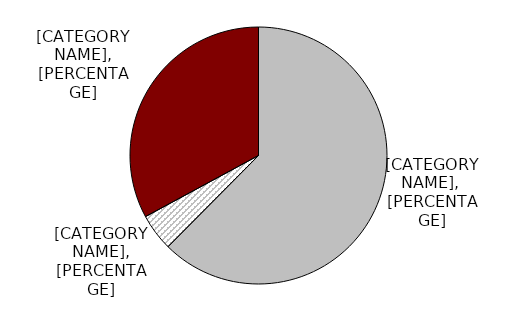
| Category | Series 0 |
|---|---|
| Contributing participants | 0.624 |
| Non-contributing participants | 0.047 |
| Non-participants | 0.329 |